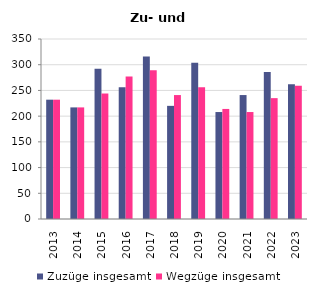
| Category | Zuzüge insgesamt | Wegzüge insgesamt |
|---|---|---|
| 2013.0 | 232 | 232 |
| 2014.0 | 217 | 217 |
| 2015.0 | 292 | 244 |
| 2016.0 | 256 | 277 |
| 2017.0 | 316 | 289 |
| 2018.0 | 220 | 241 |
| 2019.0 | 304 | 256 |
| 2020.0 | 208 | 214 |
| 2021.0 | 241 | 208 |
| 2022.0 | 286 | 235 |
| 2023.0 | 262 | 259 |